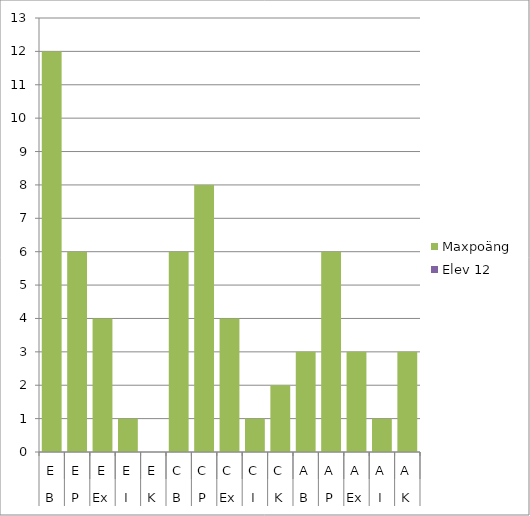
| Category | Maxpoäng | Elev 12 |
|---|---|---|
| 0 | 12 | 0 |
| 1 | 6 | 0 |
| 2 | 4 | 0 |
| 3 | 1 | 0 |
| 4 | 0 | 0 |
| 5 | 6 | 0 |
| 6 | 8 | 0 |
| 7 | 4 | 0 |
| 8 | 1 | 0 |
| 9 | 2 | 0 |
| 10 | 3 | 0 |
| 11 | 6 | 0 |
| 12 | 3 | 0 |
| 13 | 1 | 0 |
| 14 | 3 | 0 |